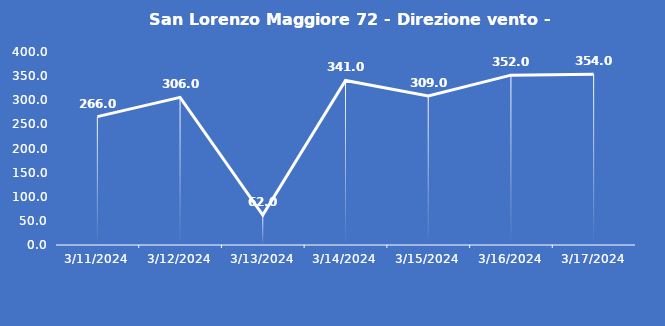
| Category | San Lorenzo Maggiore 72 - Direzione vento - Grezzo (°N) |
|---|---|
| 3/11/24 | 266 |
| 3/12/24 | 306 |
| 3/13/24 | 62 |
| 3/14/24 | 341 |
| 3/15/24 | 309 |
| 3/16/24 | 352 |
| 3/17/24 | 354 |